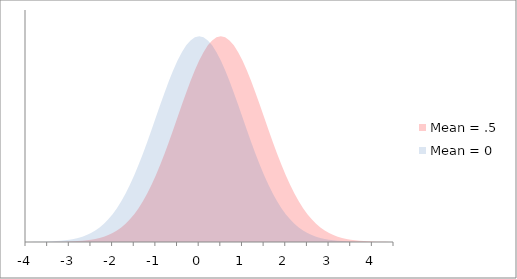
| Category | Mean = .5 | Mean = 0 |
|---|---|---|
| -4.0 | 0 | 0 |
| -3.9 | 0 | 0 |
| -3.8 | 0 | 0 |
| -3.6999999999999997 | 0 | 0 |
| -3.5999999999999996 | 0 | 0.001 |
| -3.4999999999999996 | 0 | 0.001 |
| -3.3999999999999995 | 0 | 0.001 |
| -3.2999999999999994 | 0 | 0.002 |
| -3.1999999999999993 | 0 | 0.002 |
| -3.099999999999999 | 0.001 | 0.003 |
| -2.999999999999999 | 0.001 | 0.004 |
| -2.899999999999999 | 0.001 | 0.006 |
| -2.799999999999999 | 0.002 | 0.008 |
| -2.699999999999999 | 0.002 | 0.01 |
| -2.5999999999999988 | 0.003 | 0.014 |
| -2.4999999999999987 | 0.004 | 0.018 |
| -2.3999999999999986 | 0.006 | 0.022 |
| -2.2999999999999985 | 0.008 | 0.028 |
| -2.1999999999999984 | 0.01 | 0.035 |
| -2.0999999999999983 | 0.014 | 0.044 |
| -1.9999999999999982 | 0.018 | 0.054 |
| -1.8999999999999981 | 0.022 | 0.066 |
| -1.799999999999998 | 0.028 | 0.079 |
| -1.699999999999998 | 0.035 | 0.094 |
| -1.5999999999999979 | 0.044 | 0.111 |
| -1.4999999999999978 | 0.054 | 0.13 |
| -1.3999999999999977 | 0.066 | 0.15 |
| -1.2999999999999976 | 0.079 | 0.171 |
| -1.1999999999999975 | 0.094 | 0.194 |
| -1.0999999999999974 | 0.111 | 0.218 |
| -0.9999999999999974 | 0.13 | 0.242 |
| -0.8999999999999975 | 0.15 | 0.266 |
| -0.7999999999999975 | 0.171 | 0.29 |
| -0.6999999999999975 | 0.194 | 0.312 |
| -0.5999999999999975 | 0.218 | 0.333 |
| -0.49999999999999756 | 0.242 | 0.352 |
| -0.3999999999999976 | 0.266 | 0.368 |
| -0.2999999999999976 | 0.29 | 0.381 |
| -0.1999999999999976 | 0.312 | 0.391 |
| -0.09999999999999759 | 0.333 | 0.397 |
| 0.0 | 0.352 | 0.399 |
| 0.1 | 0.368 | 0.397 |
| 0.2 | 0.381 | 0.391 |
| 0.30000000000000004 | 0.391 | 0.381 |
| 0.4 | 0.397 | 0.368 |
| 0.5 | 0.399 | 0.352 |
| 0.6 | 0.397 | 0.333 |
| 0.7 | 0.391 | 0.312 |
| 0.7999999999999999 | 0.381 | 0.29 |
| 0.8999999999999999 | 0.368 | 0.266 |
| 0.9999999999999999 | 0.352 | 0.242 |
| 1.0999999999999999 | 0.333 | 0.218 |
| 1.2 | 0.312 | 0.194 |
| 1.3 | 0.29 | 0.171 |
| 1.4000000000000001 | 0.266 | 0.15 |
| 1.5000000000000002 | 0.242 | 0.13 |
| 1.6000000000000003 | 0.218 | 0.111 |
| 1.7000000000000004 | 0.194 | 0.094 |
| 1.8000000000000005 | 0.171 | 0.079 |
| 1.9000000000000006 | 0.15 | 0.066 |
| 2.0000000000000004 | 0.13 | 0.054 |
| 2.1000000000000005 | 0.111 | 0.044 |
| 2.2000000000000006 | 0.094 | 0.035 |
| 2.3000000000000007 | 0.079 | 0.028 |
| 2.400000000000001 | 0.066 | 0.022 |
| 2.500000000000001 | 0.054 | 0.018 |
| 2.600000000000001 | 0.044 | 0.014 |
| 2.700000000000001 | 0.035 | 0.01 |
| 2.800000000000001 | 0.028 | 0.008 |
| 2.9000000000000012 | 0.022 | 0.006 |
| 3.0000000000000013 | 0.018 | 0.004 |
| 3.1000000000000014 | 0.014 | 0.003 |
| 3.2000000000000015 | 0.01 | 0.002 |
| 3.3000000000000016 | 0.008 | 0.002 |
| 3.4000000000000017 | 0.006 | 0.001 |
| 3.5000000000000018 | 0.004 | 0.001 |
| 3.600000000000002 | 0.003 | 0.001 |
| 3.700000000000002 | 0.002 | 0 |
| 3.800000000000002 | 0.002 | 0 |
| 3.900000000000002 | 0.001 | 0 |
| 4.000000000000002 | 0.001 | 0 |
| 4.100000000000001 | 0.001 | 0 |
| 4.200000000000001 | 0 | 0 |
| 4.300000000000001 | 0 | 0 |
| 4.4 | 0 | 0 |
| 4.5 | 0 | 0 |